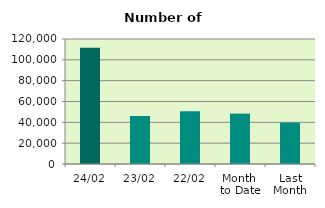
| Category | Series 0 |
|---|---|
| 24/02 | 111612 |
| 23/02 | 46054 |
| 22/02 | 50650 |
| Month 
to Date | 48363.333 |
| Last
Month | 39786.667 |